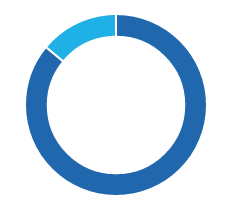
| Category | Series 0 |
|---|---|
| ● Votes cast | 0.86 |
| ● No votes cast | 0.14 |